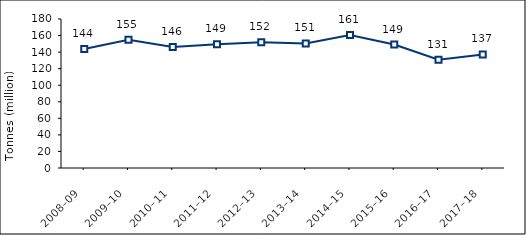
| Category | Total plastic |
|---|---|
| 2008–09 | 143649 |
| 2009–10 | 154806 |
| 2010–11 | 146203 |
| 2011–12 | 149454 |
| 2012–13 | 152001 |
| 2013–14 | 150553 |
| 2014–15 | 160533.84 |
| 2015–16 | 149127.57 |
| 2016–17 | 130695.1 |
| 2017–18 | 137167.42 |